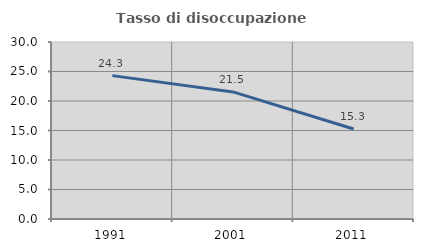
| Category | Tasso di disoccupazione giovanile  |
|---|---|
| 1991.0 | 24.299 |
| 2001.0 | 21.538 |
| 2011.0 | 15.254 |